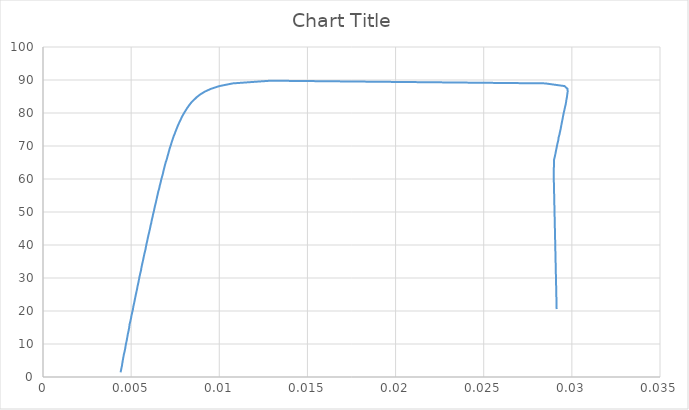
| Category | Series 0 |
|---|---|
| 0.00440244097262621 | 1.409 |
| 0.00443595508113503 | 2.355 |
| 0.0044729532673955 | 3.263 |
| 0.00450077606365085 | 4.197 |
| 0.00452614948153496 | 5.051 |
| 0.00455863773822784 | 5.988 |
| 0.00459013879299164 | 6.922 |
| 0.00462949275970459 | 7.766 |
| 0.00466547068208456 | 8.723 |
| 0.00469164596870542 | 9.631 |
| 0.00472499011084437 | 10.49 |
| 0.00475816009566188 | 11.319 |
| 0.00478568393737078 | 12.183 |
| 0.00481583271175623 | 13.087 |
| 0.00485639087855816 | 14.044 |
| 0.00489037204533815 | 15.025 |
| 0.00490994425490499 | 15.896 |
| 0.0049510165117681 | 16.792 |
| 0.00499140610918403 | 17.782 |
| 0.00502224545925856 | 18.682 |
| 0.00506085250526667 | 19.601 |
| 0.00510142557322979 | 20.486 |
| 0.00512422481551766 | 21.332 |
| 0.00516041135415435 | 22.19 |
| 0.00519868452101946 | 23.161 |
| 0.00522982189431787 | 23.989 |
| 0.0052607930265367 | 24.817 |
| 0.0052988063544035 | 25.762 |
| 0.00533740734681487 | 26.694 |
| 0.00536810467019677 | 27.62 |
| 0.00540952570736408 | 28.564 |
| 0.00544216949492693 | 29.482 |
| 0.00547648780047894 | 30.424 |
| 0.00551381520926952 | 31.352 |
| 0.00555726513266563 | 32.232 |
| 0.00558416452258825 | 33.139 |
| 0.00561813125386834 | 34.025 |
| 0.00565715879201889 | 34.93 |
| 0.00569245405495167 | 35.834 |
| 0.00572946527972817 | 36.762 |
| 0.00576710049062967 | 37.697 |
| 0.00581110082566738 | 38.586 |
| 0.00584196485579014 | 39.518 |
| 0.00587522005662322 | 40.435 |
| 0.0059177060611546 | 41.371 |
| 0.00595261808484793 | 42.285 |
| 0.00598904537037015 | 43.164 |
| 0.00602852692827582 | 44.024 |
| 0.00606820220127702 | 44.955 |
| 0.00609878683462739 | 45.799 |
| 0.00613977713510394 | 46.637 |
| 0.00616920925676823 | 47.531 |
| 0.00621126778423786 | 48.418 |
| 0.00624384637922049 | 49.306 |
| 0.00628768187016249 | 50.228 |
| 0.00632058409973979 | 51.067 |
| 0.00635618483647704 | 51.926 |
| 0.00639756582677364 | 52.789 |
| 0.00643426878377795 | 53.655 |
| 0.00646804599091411 | 54.514 |
| 0.00650606257840991 | 55.366 |
| 0.00654115295037627 | 56.229 |
| 0.00659436173737049 | 57.184 |
| 0.0066246697679162 | 58.025 |
| 0.00666715297847986 | 58.854 |
| 0.00670598959550261 | 59.754 |
| 0.00674612447619438 | 60.573 |
| 0.00679420493543148 | 61.443 |
| 0.00683184806257486 | 62.37 |
| 0.00687200063839555 | 63.27 |
| 0.00691755441948771 | 64.187 |
| 0.00696080829948187 | 65.066 |
| 0.00701843621209264 | 65.935 |
| 0.00706294598057866 | 66.845 |
| 0.00710761966183782 | 67.708 |
| 0.00715038785710931 | 68.543 |
| 0.0071961903013289 | 69.408 |
| 0.0072510470636189 | 70.258 |
| 0.00729523878544569 | 71.078 |
| 0.00735020497813821 | 71.97 |
| 0.00740480748936534 | 72.862 |
| 0.00747100217267871 | 73.697 |
| 0.00752785569056869 | 74.537 |
| 0.00759671488776803 | 75.439 |
| 0.00765761872753501 | 76.288 |
| 0.00773243652656674 | 77.124 |
| 0.00780995469540358 | 78.008 |
| 0.00788150448352098 | 78.829 |
| 0.00797164533287287 | 79.713 |
| 0.00806908495724201 | 80.566 |
| 0.0081667322665453 | 81.402 |
| 0.00827809050679207 | 82.257 |
| 0.00840316247195005 | 83.12 |
| 0.00856004282832146 | 83.961 |
| 0.0087199741974473 | 84.804 |
| 0.00892644748091698 | 85.651 |
| 0.00918341055512428 | 86.487 |
| 0.00951975211501122 | 87.311 |
| 0.00999795738607645 | 88.143 |
| 0.0107638789340854 | 88.971 |
| 0.012914196588099 | 89.789 |
| 0.028482511639595 | 88.974 |
| 0.029583727940917 | 88.159 |
| 0.0297500118613243 | 87.337 |
| 0.0297648049890995 | 86.521 |
| 0.0297405254095793 | 85.698 |
| 0.029722074046731 | 84.872 |
| 0.0296918600797653 | 84.056 |
| 0.0296708159148693 | 83.23 |
| 0.0296415574848652 | 82.416 |
| 0.0296041034162045 | 81.6 |
| 0.0295721422880888 | 80.784 |
| 0.0295354332774878 | 79.96 |
| 0.0295054391026497 | 79.137 |
| 0.0294773615896702 | 78.321 |
| 0.0294464156031609 | 77.489 |
| 0.0294157098978758 | 76.668 |
| 0.0293873939663172 | 75.84 |
| 0.0293593853712082 | 75.022 |
| 0.0293230097740889 | 74.196 |
| 0.0292918980121613 | 73.363 |
| 0.0292464140802622 | 72.544 |
| 0.0292310267686844 | 71.729 |
| 0.0291903372853994 | 70.909 |
| 0.0291575267910957 | 70.087 |
| 0.029125165194273 | 69.248 |
| 0.0290948636829853 | 68.411 |
| 0.0290649197995663 | 67.57 |
| 0.0290309377014637 | 66.737 |
| 0.0289938077330589 | 65.914 |
| 0.0289691388607025 | 61.639 |
| 0.0291369222104549 | 20.571 |